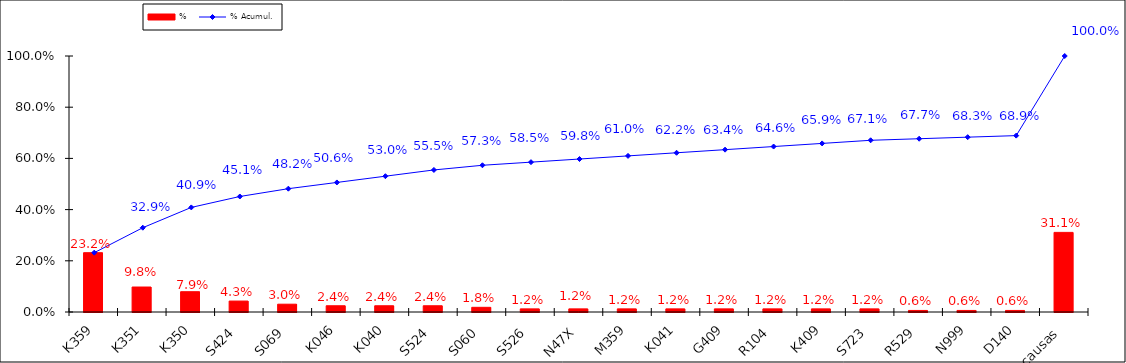
| Category | % |
|---|---|
| K359 | 0.232 |
| K351 | 0.098 |
| K350 | 0.079 |
| S424 | 0.043 |
| S069 | 0.03 |
| K046 | 0.024 |
| K040 | 0.024 |
| S524 | 0.024 |
| S060 | 0.018 |
| S526 | 0.012 |
| N47X | 0.012 |
| M359 | 0.012 |
| K041 | 0.012 |
| G409 | 0.012 |
| R104 | 0.012 |
| K409 | 0.012 |
| S723 | 0.012 |
| R529 | 0.006 |
| N999 | 0.006 |
| D140 | 0.006 |
| Otras causas | 0.311 |